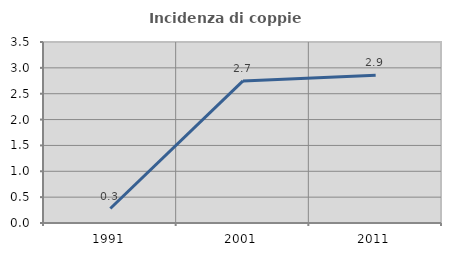
| Category | Incidenza di coppie miste |
|---|---|
| 1991.0 | 0.28 |
| 2001.0 | 2.747 |
| 2011.0 | 2.857 |